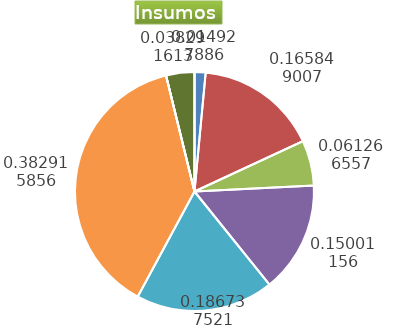
| Category | Series 0 |
|---|---|
| Control arvenses | 268323 |
| Control fitosanitario | 2981072 |
| Cosecha y beneficio | 1101242.751 |
| Fertilización | 2696400 |
| Instalación | 3356535 |
| Otros | 6882765 |
| Podas | 0 |
| Riego | 0 |
| Transporte | 688277 |
| Tutorado | 0 |